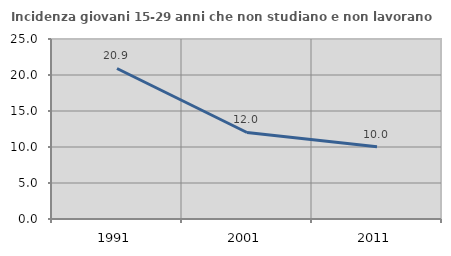
| Category | Incidenza giovani 15-29 anni che non studiano e non lavorano  |
|---|---|
| 1991.0 | 20.903 |
| 2001.0 | 12.016 |
| 2011.0 | 10.048 |